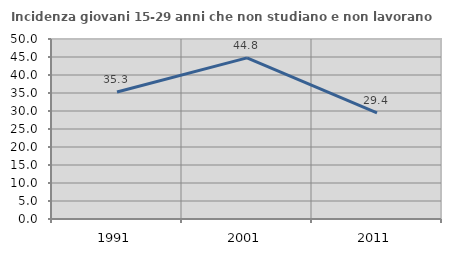
| Category | Incidenza giovani 15-29 anni che non studiano e non lavorano  |
|---|---|
| 1991.0 | 35.269 |
| 2001.0 | 44.75 |
| 2011.0 | 29.448 |